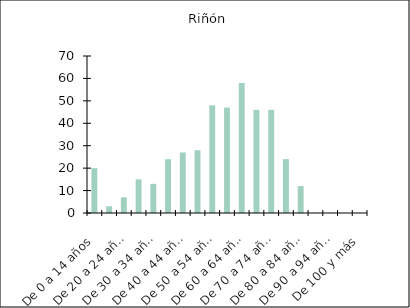
| Category | Riñón |
|---|---|
| De 0 a 14 años | 20 |
| De 15 a 19 años | 3 |
| De 20 a 24 años | 7 |
| De 25 a 29 años | 15 |
| De 30 a 34 años | 13 |
| De 35 a 39 años | 24 |
| De 40 a 44 años | 27 |
| De 45 a 49 años | 28 |
| De 50 a 54 años | 48 |
| De 55 a 59 años | 47 |
| De 60 a 64 años | 58 |
| De 65 a 69 años | 46 |
| De 70 a 74 años | 46 |
| De 75 a 79 años | 24 |
| De 80 a 84 años | 12 |
| De 85 a 89 años | 0 |
| De 90 a 94 años | 0 |
| De 95 a 99 años | 0 |
| De 100 y más | 0 |